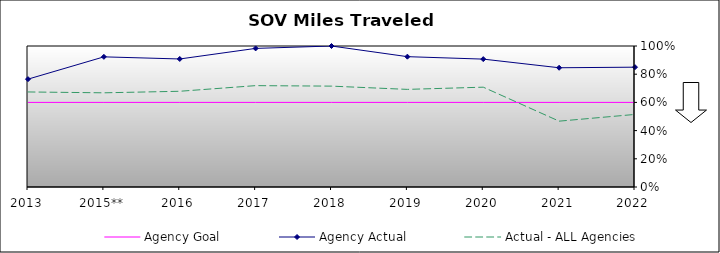
| Category | Agency Goal | Agency Actual | Actual - ALL Agencies |
|---|---|---|---|
| 2013 | 0.6 | 0.765 | 0.674 |
| 2015** | 0.6 | 0.923 | 0.668 |
| 2016 | 0.6 | 0.908 | 0.679 |
| 2017 | 0.6 | 0.983 | 0.719 |
| 2018 | 0.6 | 1 | 0.715 |
| 2019 | 0.6 | 0.924 | 0.692 |
| 2020 | 0.6 | 0.907 | 0.708 |
| 2021 | 0.6 | 0.846 | 0.467 |
| 2022 | 0.6 | 0.85 | 0.515 |